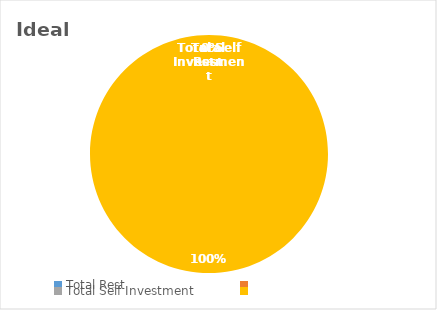
| Category | Ideal |
|---|---|
| Total Rest | 0 |
| Total Self Investment | 0 |
| Total Fixed | 0 |
| Remaining time | 24 |